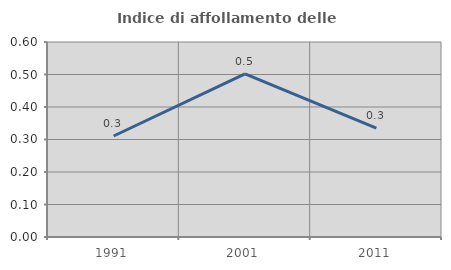
| Category | Indice di affollamento delle abitazioni  |
|---|---|
| 1991.0 | 0.311 |
| 2001.0 | 0.502 |
| 2011.0 | 0.335 |